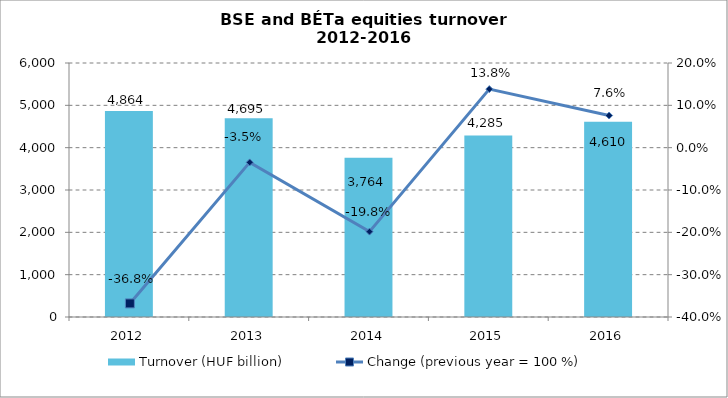
| Category | Turnover (HUF billion) |
|---|---|
| 2012.0 | 4864 |
| 2013.0 | 4695 |
| 2014.0 | 3764 |
| 2015.0 | 4284.718 |
| 2016.0 | 4610 |